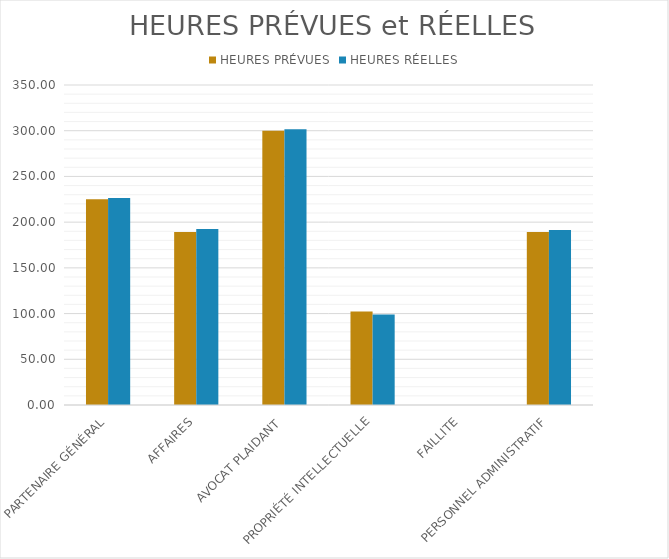
| Category | HEURES PRÉVUES | HEURES RÉELLES |
|---|---|---|
| PARTENAIRE GÉNÉRAL | 225 | 226.5 |
| AFFAIRES | 189.286 | 192.5 |
| AVOCAT PLAIDANT | 300 | 301.714 |
| PROPRIÉTÉ INTELLECTUELLE | 102.143 | 99 |
| FAILLITE | 0 | 0 |
| PERSONNEL ADMINISTRATIF | 189.286 | 191.429 |